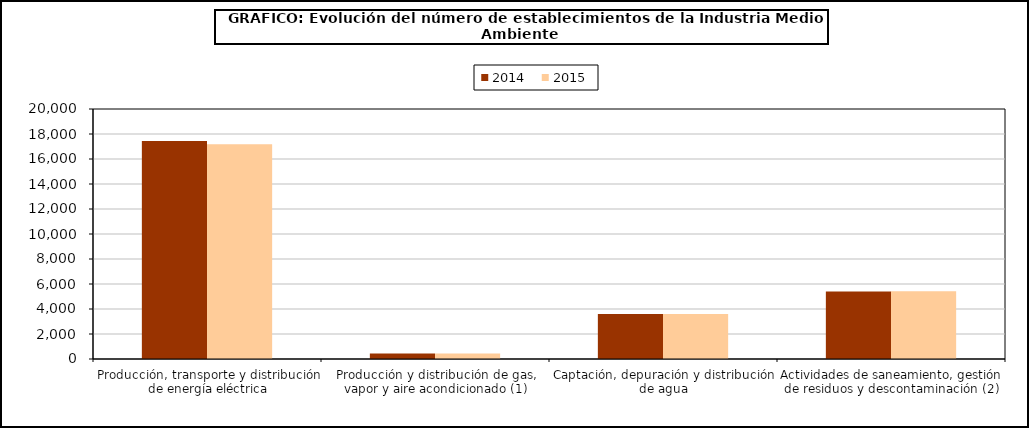
| Category | 2014 | 2015 |
|---|---|---|
| Producción, transporte y distribución de energía eléctrica | 17447 | 17185 |
| Producción y distribución de gas, vapor y aire acondicionado (1) | 436 | 443 |
| Captación, depuración y distribución de agua | 3602 | 3608 |
| Actividades de saneamiento, gestión de residuos y descontaminación (2) | 5397 | 5412 |